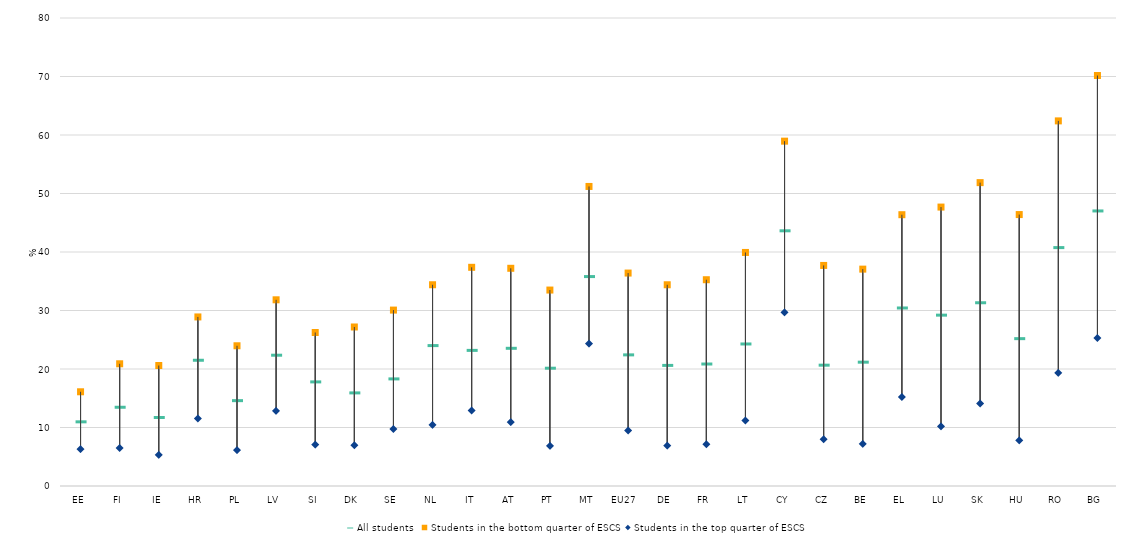
| Category | All students | Students in the bottom quarter of ESCS | Students in the top quarter of ESCS |
|---|---|---|---|
| EE | 11.054 | 16.106 | 6.309 |
| FI | 13.545 | 20.892 | 6.501 |
| IE | 11.799 | 20.594 | 5.328 |
| HR | 21.579 | 28.901 | 11.541 |
| PL | 14.676 | 23.971 | 6.146 |
| LV | 22.443 | 31.829 | 12.841 |
| SI | 17.881 | 26.243 | 7.083 |
| DK | 16 | 27.183 | 6.975 |
| SE | 18.393 | 30.071 | 9.741 |
| NL | 24.087 | 34.402 | 10.452 |
| IT | 23.267 | 37.384 | 12.912 |
| AT | 23.623 | 37.216 | 10.902 |
| PT | 20.222 | 33.495 | 6.857 |
| MT | 35.886 | 51.205 | 24.34 |
| EU27  | 22.5 | 36.4 | 9.5 |
| DE | 20.7 | 34.4 | 6.9 |
| FR | 20.937 | 35.261 | 7.126 |
| LT | 24.363 | 39.923 | 11.187 |
| CY | 43.708 | 58.948 | 29.679 |
| CZ | 20.74 | 37.704 | 7.982 |
| BE | 21.253 | 37.071 | 7.208 |
| EL | 30.516 | 46.376 | 15.229 |
| LU | 29.291 | 47.68 | 10.193 |
| SK | 31.41 | 51.859 | 14.104 |
| HU | 25.274 | 46.4 | 7.796 |
| RO | 40.838 | 62.413 | 19.336 |
| BG | 47.103 | 70.168 | 25.292 |